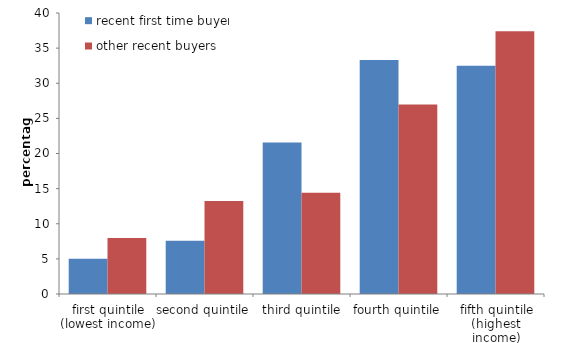
| Category | recent first time buyers | other recent buyers |
|---|---|---|
| first quintile (lowest income) | 5.031 | 7.962 |
| second quintile | 7.575 | 13.248 |
| third quintile | 21.568 | 14.425 |
| fourth quintile | 33.325 | 26.977 |
| fifth quintile (highest income) | 32.502 | 37.388 |